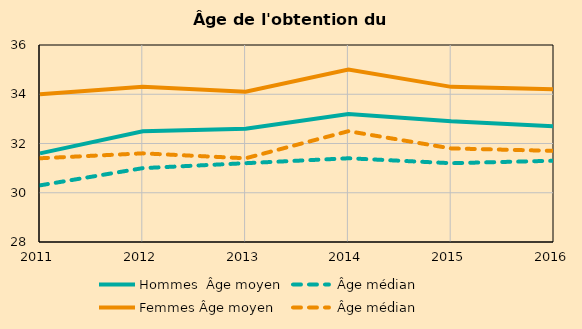
| Category | Hommes  Âge moyen | Hommes  Âge médian | Femmes Âge moyen | Femmes Âge médian |
|---|---|---|---|---|
| 2011.0 | 31.6 | 30.3 | 34 | 31.4 |
| 2012.0 | 32.5 | 31 | 34.3 | 31.6 |
| 2013.0 | 32.6 | 31.2 | 34.1 | 31.4 |
| 2014.0 | 33.2 | 31.4 | 35 | 32.5 |
| 2015.0 | 32.9 | 31.2 | 34.3 | 31.8 |
| 2016.0 | 32.7 | 31.3 | 34.2 | 31.7 |